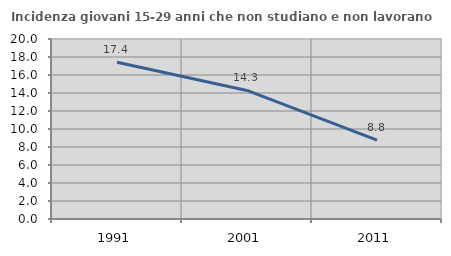
| Category | Incidenza giovani 15-29 anni che non studiano e non lavorano  |
|---|---|
| 1991.0 | 17.424 |
| 2001.0 | 14.286 |
| 2011.0 | 8.759 |